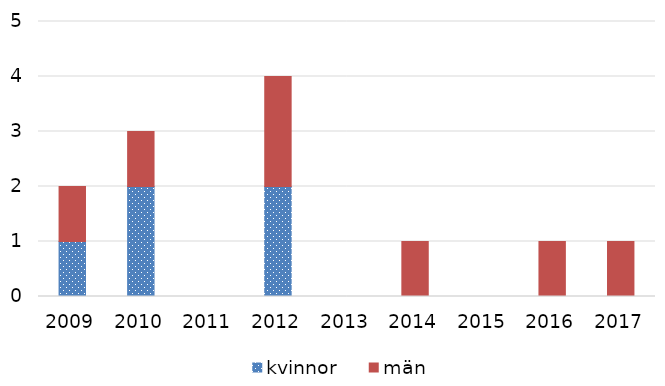
| Category | kvinnor | män |
|---|---|---|
| 2009 | 1 | 1 |
| 2010 | 2 | 1 |
| 2011 | 0 | 0 |
| 2012 | 2 | 2 |
| 2013 | 0 | 0 |
| 2014 | 0 | 1 |
| 2015 | 0 | 0 |
| 2016 | 0 | 1 |
| 2017 | 0 | 1 |